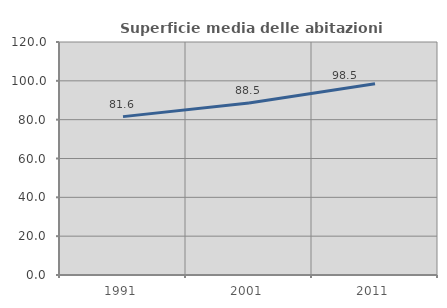
| Category | Superficie media delle abitazioni occupate |
|---|---|
| 1991.0 | 81.568 |
| 2001.0 | 88.543 |
| 2011.0 | 98.484 |